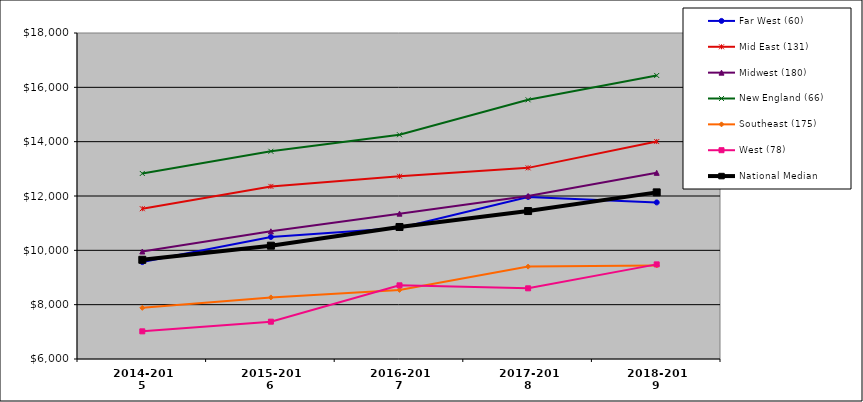
| Category | Far West (60) | Mid East (131) | Midwest (180) | New England (66) | Southeast (175) | West (78) | National Median |
|---|---|---|---|---|---|---|---|
| 2014-2015 | 9567.538 | 11532.243 | 9956.958 | 12829.305 | 7883.408 | 7018.372 | 9651.331 |
| 2015-2016 | 10491.812 | 12353.165 | 10699.796 | 13644.981 | 8266.915 | 7373.941 | 10170.953 |
| 2016-2017 | 10821.22 | 12725.888 | 11350.576 | 14254.742 | 8542.624 | 8710.76 | 10859.41 |
| 2017-2018 | 11965.137 | 13035.988 | 12000.112 | 15540.683 | 9400.645 | 8601.864 | 11445.61 |
| 2018-2019 | 11763.94 | 14003.816 | 12852.901 | 16437.24 | 9444.154 | 9482.813 | 12133.725 |